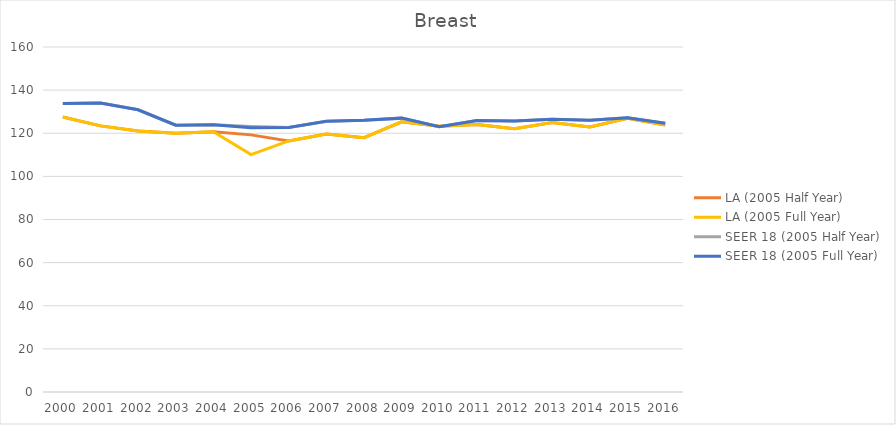
| Category | LA (2005 Half Year) | LA (2005 Full Year) | SEER 18 (2005 Half Year) | SEER 18 (2005 Full Year) |
|---|---|---|---|---|
| 2000.0 | 127.513 | 127.513 | 133.826 | 133.826 |
| 2001.0 | 123.417 | 123.417 | 134.028 | 134.028 |
| 2002.0 | 120.993 | 120.993 | 130.893 | 130.893 |
| 2003.0 | 119.962 | 119.962 | 123.731 | 123.731 |
| 2004.0 | 120.676 | 120.676 | 123.885 | 123.885 |
| 2005.0 | 119.244 | 110.074 | 123.162 | 122.552 |
| 2006.0 | 116.427 | 116.427 | 122.631 | 122.631 |
| 2007.0 | 119.679 | 119.679 | 125.52 | 125.52 |
| 2008.0 | 117.973 | 117.973 | 126.049 | 126.049 |
| 2009.0 | 125.326 | 125.326 | 127.011 | 127.011 |
| 2010.0 | 123.29 | 123.29 | 123.057 | 123.057 |
| 2011.0 | 124.067 | 124.067 | 125.864 | 125.864 |
| 2012.0 | 122.145 | 122.145 | 125.655 | 125.655 |
| 2013.0 | 124.993 | 124.993 | 126.471 | 126.471 |
| 2014.0 | 122.885 | 122.885 | 125.975 | 125.975 |
| 2015.0 | 126.903 | 126.903 | 127.222 | 127.222 |
| 2016.0 | 123.861 | 123.861 | 124.65 | 124.65 |